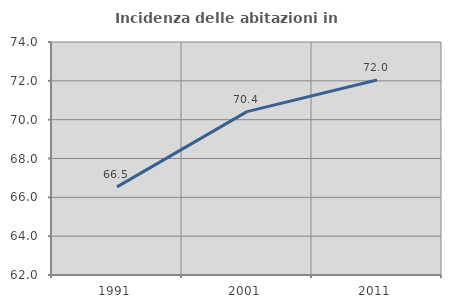
| Category | Incidenza delle abitazioni in proprietà  |
|---|---|
| 1991.0 | 66.537 |
| 2001.0 | 70.412 |
| 2011.0 | 72.044 |